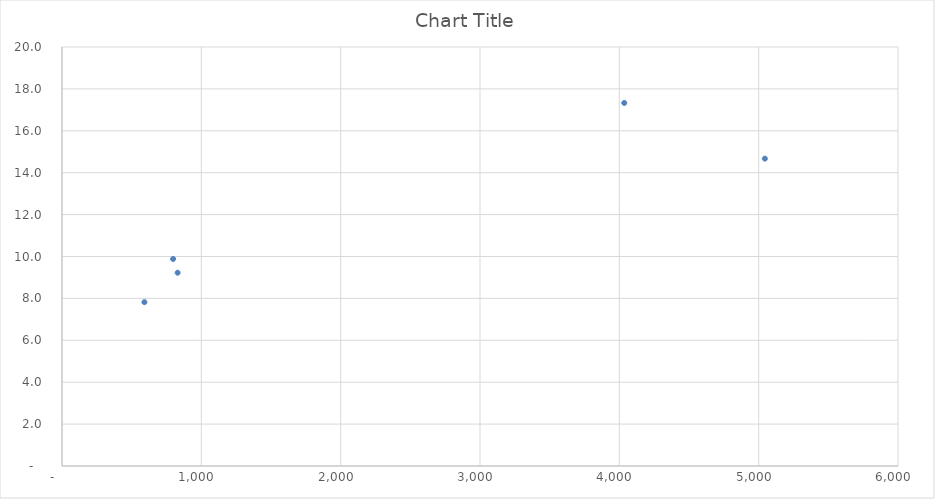
| Category | Series 0 |
|---|---|
| 591.444 | 7.82 |
| 797.454 | 9.882 |
| 829.92 | 9.227 |
| 4035.4100000000003 | 17.329 |
| 5044.43 | 14.671 |